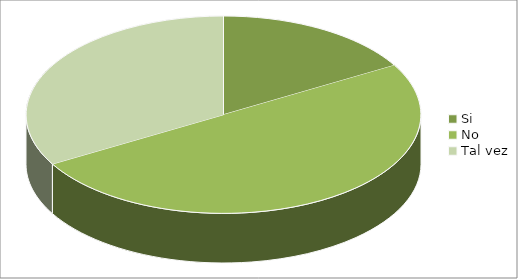
| Category | Series 0 |
|---|---|
| Si | 1 |
| No | 3 |
| Tal vez | 2 |